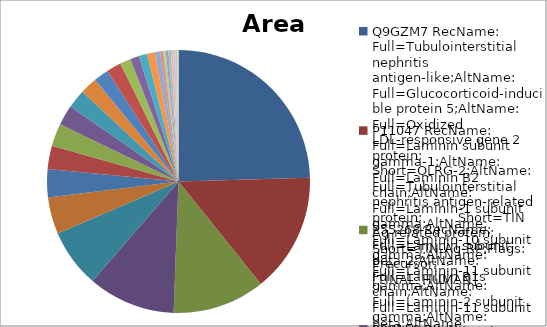
| Category | Area |
|---|---|
| 0 | 2528113104.938 |
| 1 | 1512931951 |
| 2 | 1168291885.333 |
| 3 | 1105919738.667 |
| 4 | 741979515.5 |
| 5 | 464864588.25 |
| 6 | 357791394.083 |
| 7 | 294039859.5 |
| 8 | 286555403.812 |
| 9 | 256186488.333 |
| 10 | 237420311.958 |
| 11 | 216969533.562 |
| 12 | 189169242.125 |
| 13 | 187160445.333 |
| 14 | 135352931.75 |
| 15 | 113588171.333 |
| 16 | 103875239.333 |
| 17 | 99928227.938 |
| 18 | 64020605.25 |
| 19 | 39946799.25 |
| 20 | 33976680 |
| 21 | 31973172.375 |
| 22 | 31163130.25 |
| 23 | 29307885.625 |
| 24 | 26832979 |
| 25 | 22453749.062 |
| 26 | 17650581.375 |